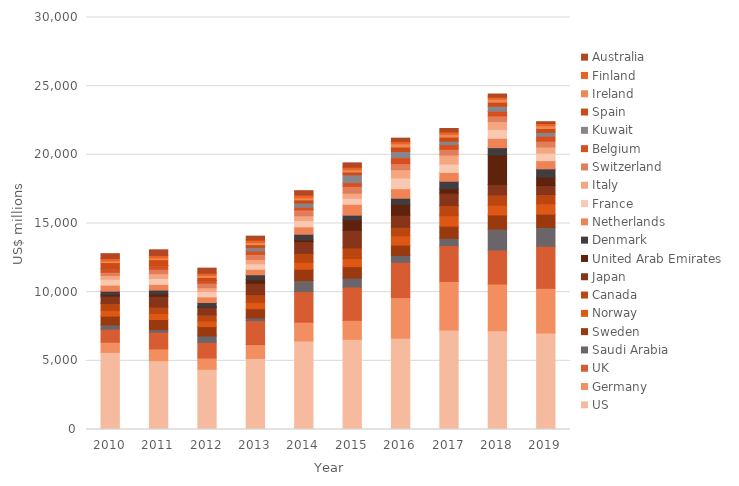
| Category | US | Germany | UK | Saudi Arabia | Sweden | Norway | Canada | Japan | United Arab Emirates | Denmark | Netherlands | France | Italy | Switzerland | Belgium | Kuwait | Spain | Ireland | Finland | Australia |
|---|---|---|---|---|---|---|---|---|---|---|---|---|---|---|---|---|---|---|---|---|
| 2010.0 | 5617.042 | 737.846 | 954.414 | 305.743 | 641.915 | 423.97 | 496.066 | 532.412 | 120.142 | 245.696 | 439.06 | 428.708 | 275.321 | 230.291 | 231.32 | 11.272 | 463.454 | 127.37 | 171.473 | 349.723 |
| 2011.0 | 5008.247 | 857.92 | 1224.87 | 195.794 | 721.018 | 443.263 | 465.3 | 781.646 | 171.387 | 279.816 | 420.5 | 432.825 | 343.817 | 318.947 | 267.138 | 10.605 | 423.625 | 128.297 | 180.621 | 408.356 |
| 2012.0 | 4385.47 | 820.865 | 1142.999 | 464.972 | 675.538 | 409.429 | 448.522 | 549.442 | 37.49 | 309.907 | 408.59 | 394.411 | 277.449 | 328.698 | 186.487 | 8.706 | 225.15 | 150.75 | 157.663 | 367.922 |
| 2013.0 | 5175.386 | 1009.84 | 1743.82 | 194.554 | 668.311 | 470.821 | 557.104 | 820.699 | 271.572 | 352.98 | 400.255 | 399.901 | 318.729 | 370.176 | 247.27 | 260.704 | 199.644 | 152.6 | 174.981 | 291.454 |
| 2014.0 | 6447.767 | 1366.058 | 2228.921 | 802.475 | 821.49 | 517.401 | 641.307 | 852.627 | 133.642 | 408.421 | 535.043 | 456.259 | 353.217 | 426.648 | 191.094 | 306.065 | 230.89 | 156.85 | 191.103 | 322.212 |
| 2015.0 | 6568.77 | 1380.248 | 2421.776 | 654.727 | 828.737 | 594.022 | 773.665 | 1283.937 | 766.889 | 334.414 | 794.924 | 442.825 | 368.484 | 489.954 | 266.313 | 576.81 | 203.283 | 166.902 | 177.909 | 320.578 |
| 2016.0 | 6648.154 | 2959.231 | 2571.006 | 494.168 | 757.109 | 680.482 | 611.959 | 874.065 | 801.332 | 441.478 | 693.406 | 786.385 | 605.517 | 439.48 | 426.644 | 456.02 | 321.543 | 235.045 | 177.809 | 234.176 |
| 2017.0 | 7241.588 | 3537.71 | 2605.097 | 536.289 | 881.896 | 760.833 | 748.271 | 897.942 | 320.697 | 545.614 | 644.209 | 613.289 | 650.121 | 417.029 | 336.711 | 258.085 | 293.342 | 215.405 | 163.246 | 252.293 |
| 2018.0 | 7196.072 | 3396.527 | 2479.236 | 1518.864 | 1033.38 | 706.905 | 755.398 | 746.376 | 2164.34 | 525.884 | 681.523 | 645.818 | 581.28 | 409.9 | 330.206 | 373.542 | 289.268 | 219.245 | 142.471 | 232.523 |
| 2019.0 | 7024.667 | 3254.735 | 3067.014 | 1364.887 | 964.709 | 770.035 | 663.7 | 650.212 | 619.555 | 600.823 | 593.802 | 548.964 | 451.503 | 423.051 | 360.254 | 279.355 | 276.408 | 205.535 | 163.132 | 129.924 |